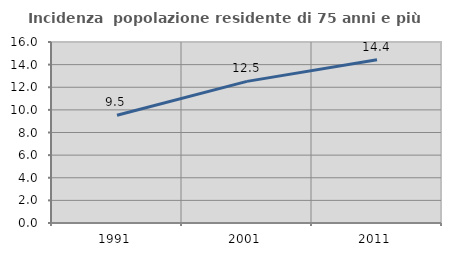
| Category | Incidenza  popolazione residente di 75 anni e più |
|---|---|
| 1991.0 | 9.526 |
| 2001.0 | 12.521 |
| 2011.0 | 14.44 |